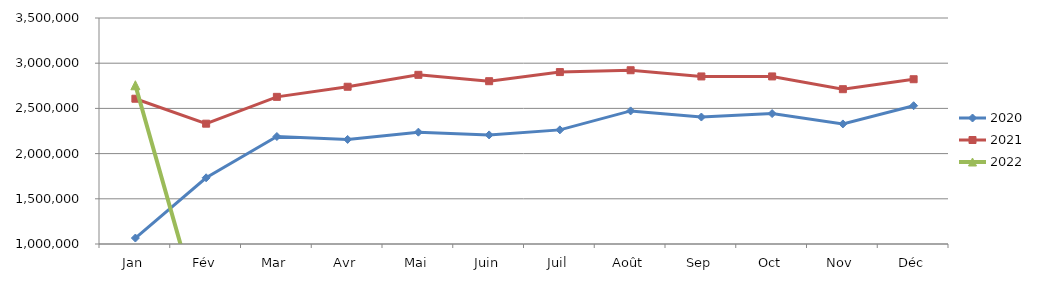
| Category | 2020 | 2021 | 2022 |
|---|---|---|---|
| Jan | 1065914.395 | 2606997.263 | 2755933.991 |
| Fév | 1732446.596 | 2330972.971 | 0 |
| Mar | 2188822.187 | 2627784.258 | 0 |
| Avr | 2156692.388 | 2739322.316 | 0 |
| Mai | 2237302.96 | 2871301.078 | 0 |
| Juin | 2206664.409 | 2800973.605 | 0 |
| Juil | 2262469.236 | 2901835.671 | 0 |
| Août | 2472399.146 | 2922140.191 | 0 |
| Sep | 2404432.621 | 2853410.497 | 0 |
| Oct | 2442779.508 | 2853580.553 | 0 |
| Nov | 2328229.47 | 2712524.771 | 0 |
| Déc | 2529675.124 | 2822679.51 | 0 |